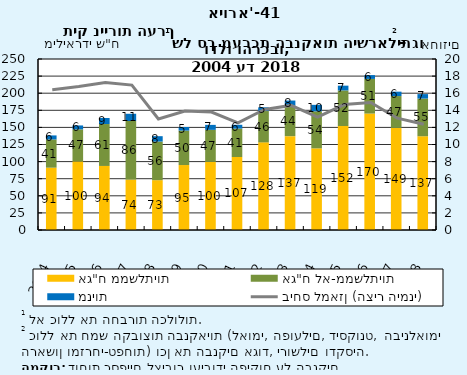
| Category | אג"ח ממשלתיות | אג"ח לא-ממשלתיות | מניות |
|---|---|---|---|
| 2004.0 | 91.126 | 41.25 | 5.897 |
| 2005.0 | 100.249 | 46.883 | 5.719 |
| 2006.0 | 93.639 | 61.287 | 8.852 |
| 2007.0 | 73.7 | 85.624 | 10.6 |
| 2008.0 | 72.856 | 56.44 | 7.853 |
| 2009.0 | 94.968 | 50.358 | 5.266 |
| 2010.0 | 99.652 | 46.739 | 7.299 |
| 2011.0 | 106.734 | 41.489 | 5.601 |
| 2012.0 | 128.124 | 45.796 | 5.459 |
| 2013.0 | 137.215 | 44.436 | 7.607 |
| 2014.0 | 119.373 | 54.039 | 9.544 |
| 2015.0 | 152.016 | 52.04 | 6.971 |
| 2016.0 | 170.263 | 50.627 | 5.545 |
| 2017.0 | 149.289 | 46.563 | 6.396 |
| 2018.0 | 137.084 | 55.056 | 6.541 |